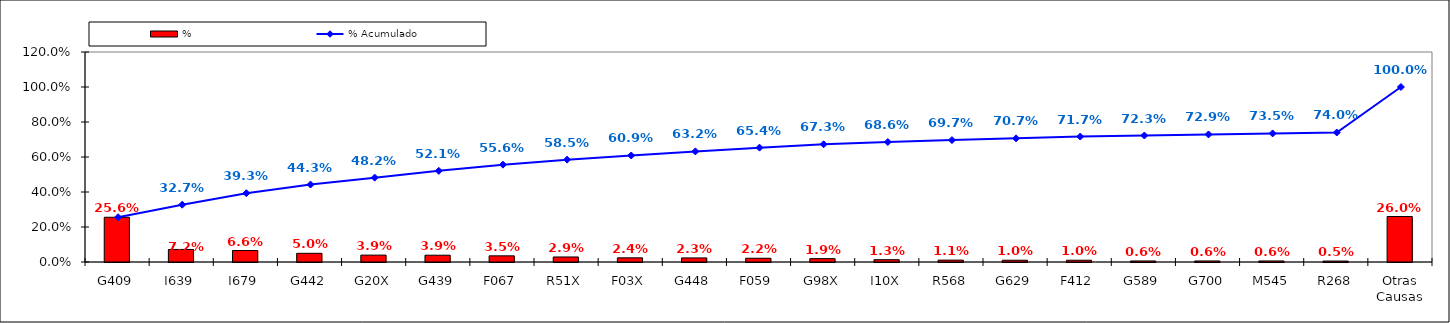
| Category | % |
|---|---|
| G409 | 0.256 |
| I639 | 0.072 |
| I679 | 0.066 |
| G442 | 0.05 |
| G20X | 0.039 |
| G439 | 0.039 |
| F067 | 0.035 |
| R51X | 0.029 |
| F03X | 0.024 |
| G448 | 0.023 |
| F059 | 0.022 |
| G98X | 0.019 |
| I10X | 0.013 |
| R568 | 0.011 |
| G629 | 0.01 |
| F412 | 0.01 |
| G589 | 0.006 |
| G700 | 0.006 |
| M545 | 0.006 |
| R268 | 0.005 |
| Otras Causas | 0.26 |